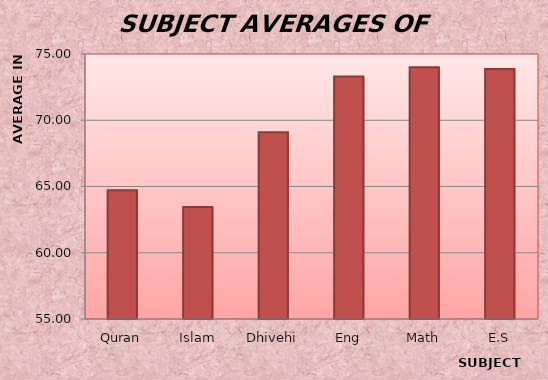
| Category | Series 0 |
|---|---|
| Quran | 64.724 |
| Islam | 63.448 |
| Dhivehi | 69.103 |
| Eng | 73.31 |
| Math | 74 |
| E.S | 73.862 |